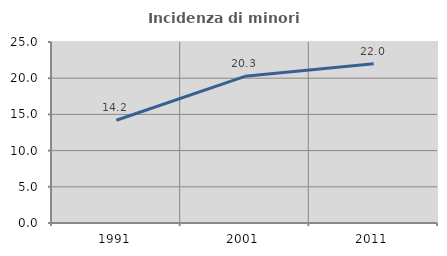
| Category | Incidenza di minori stranieri |
|---|---|
| 1991.0 | 14.198 |
| 2001.0 | 20.254 |
| 2011.0 | 21.984 |